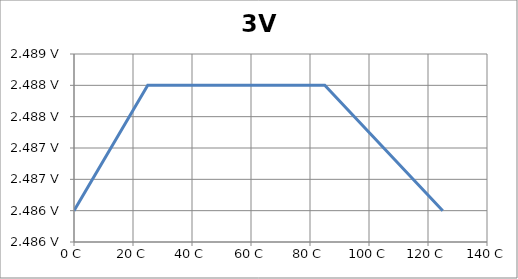
| Category | 3V 500mA |
|---|---|
| 0.0 | 2.486 |
| 25.0 | 2.488 |
| 70.0 | 2.488 |
| 85.0 | 2.488 |
| 125.0 | 2.486 |